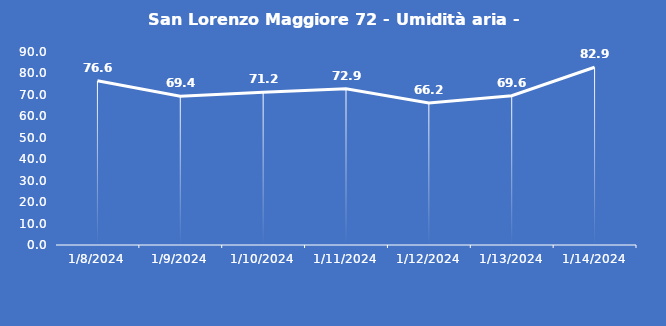
| Category | San Lorenzo Maggiore 72 - Umidità aria - Grezzo (%) |
|---|---|
| 1/8/24 | 76.6 |
| 1/9/24 | 69.4 |
| 1/10/24 | 71.2 |
| 1/11/24 | 72.9 |
| 1/12/24 | 66.2 |
| 1/13/24 | 69.6 |
| 1/14/24 | 82.9 |